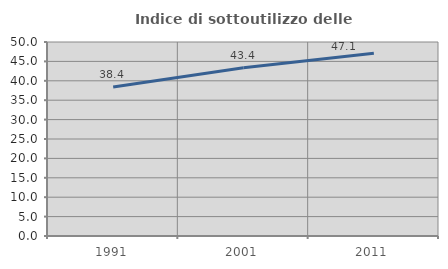
| Category | Indice di sottoutilizzo delle abitazioni  |
|---|---|
| 1991.0 | 38.385 |
| 2001.0 | 43.364 |
| 2011.0 | 47.115 |